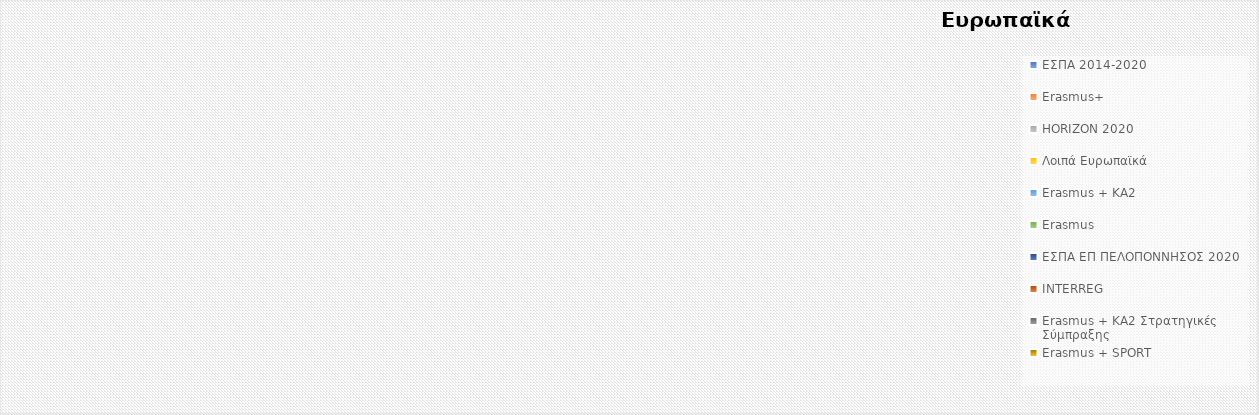
| Category | Έργα |
|---|---|
| ΕΣΠΑ 2014-2020 | 0 |
| Erasmus+ | 0 |
| HORIZON 2020 | 0 |
| Λοιπά Ευρωπαϊκά | 0 |
| Erasmus + KA2 | 0 |
| Erasmus | 0 |
| ΕΣΠΑ ΕΠ ΠΕΛΟΠΟΝΝΗΣΟΣ 2020 | 0 |
| INTERREG | 0 |
| Erasmus + KA2 Στρατηγικές Σύμπραξης | 0 |
| Erasmus + SPORT | 0 |